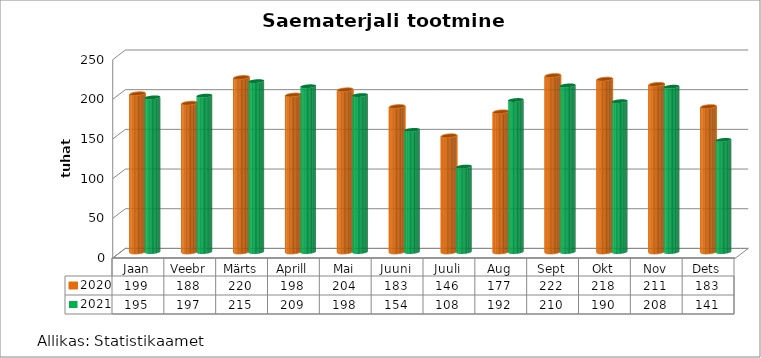
| Category | 2020 | 2021 |
|---|---|---|
| Jaan | 199.432 | 194.855 |
| Veebr | 187.503 | 197.013 |
| Märts | 219.896 | 215.267 |
| Aprill | 197.843 | 208.841 |
| Mai | 204.421 | 197.725 |
| Juuni | 183.284 | 153.828 |
| Juuli | 146.441 | 107.615 |
| Aug | 176.642 | 191.507 |
| Sept | 222.35 | 209.922 |
| Okt | 217.799 | 190.008 |
| Nov | 211.202 | 208.277 |
| Dets | 183.177 | 141.224 |